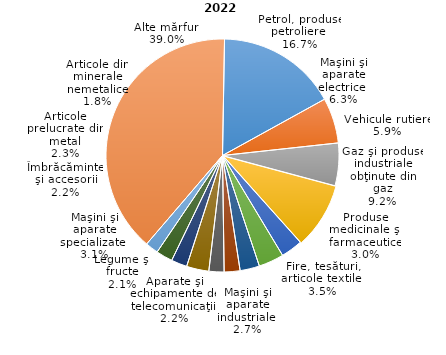
| Category | % |
|---|---|
| Petrol, produse petroliere  | 16.7 |
| Maşini şi aparate electrice  | 6.3 |
| Vehicule rutiere | 5.9 |
| Gaz şi produse industriale obţinute din gaz | 9.2 |
| Produse medicinale şi farmaceutice | 3 |
| Fire, tesături, articole textile  | 3.5 |
| Maşini şi aparate industriale  | 2.7 |
| Aparate şi echipamente de telecomunicaţii  | 2.2 |
| Legume şi fructe | 2.1 |
| Maşini şi aparate specializate  | 3.1 |
| Îmbrăcăminte şi accesorii | 2.2 |
| Articole prelucrate din metal | 2.3 |
| Articole din minerale nemetalice | 1.8 |
| Alte mărfuri | 39 |